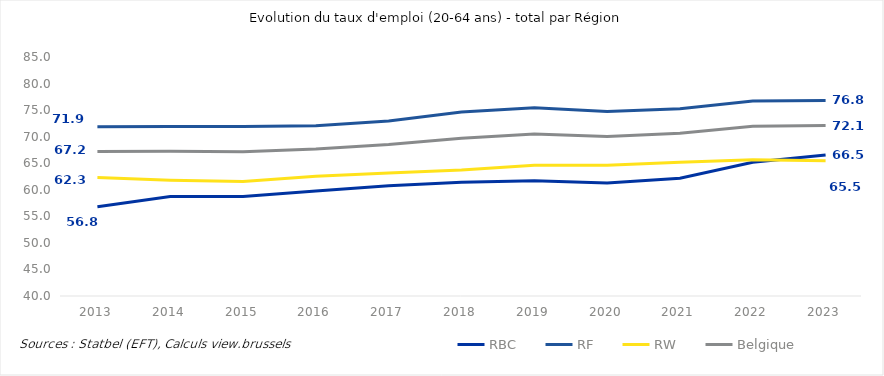
| Category | RBC | RF | RW | Belgique |
|---|---|---|---|---|
| 2013.0 | 56.82 | 71.879 | 62.308 | 67.196 |
| 2014.0 | 58.727 | 71.936 | 61.817 | 67.274 |
| 2015.0 | 58.721 | 71.92 | 61.542 | 67.171 |
| 2016.0 | 59.757 | 72.033 | 62.569 | 67.677 |
| 2017.0 | 60.762 | 72.969 | 63.16 | 68.513 |
| 2018.0 | 61.439 | 74.642 | 63.717 | 69.722 |
| 2019.0 | 61.679 | 75.451 | 64.628 | 70.497 |
| 2020.0 | 61.296 | 74.726 | 64.604 | 70.027 |
| 2021.0 | 62.19 | 75.271 | 65.197 | 70.624 |
| 2022.0 | 65.171 | 76.734 | 65.655 | 71.941 |
| 2023.0 | 66.544 | 76.818 | 65.461 | 72.087 |